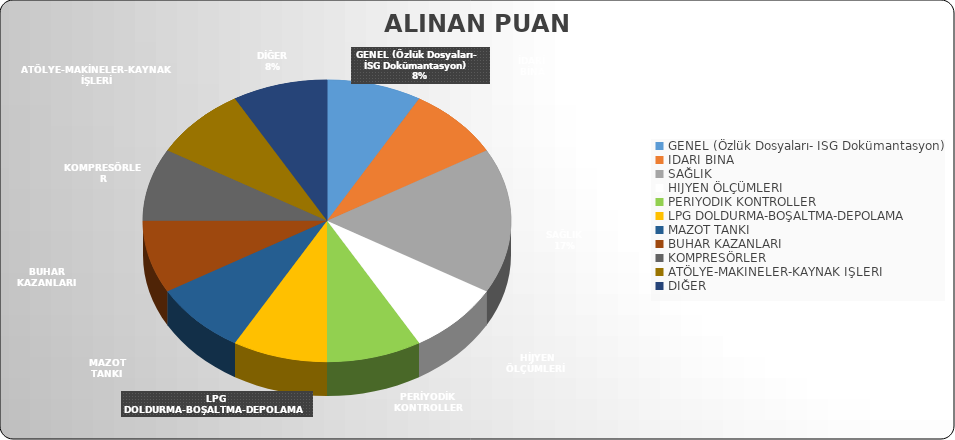
| Category | ALINAN PUAN | Series 1 |
|---|---|---|
| GENEL (Özlük Dosyaları- İSG Dokümantasyon) | 10 |  |
| İDARİ BİNA | 10 |  |
| SAĞLIK  | 20 |  |
| HİJYEN ÖLÇÜMLERİ  | 10 |  |
| PERİYODİK KONTROLLER | 10 |  |
| LPG DOLDURMA-BOŞALTMA-DEPOLAMA | 10 |  |
| MAZOT TANKI | 10 |  |
| BUHAR KAZANLARI | 10 |  |
| KOMPRESÖRLER | 10 |  |
| ATÖLYE-MAKİNELER-KAYNAK İŞLERİ | 10 |  |
| DİĞER | 10 |  |